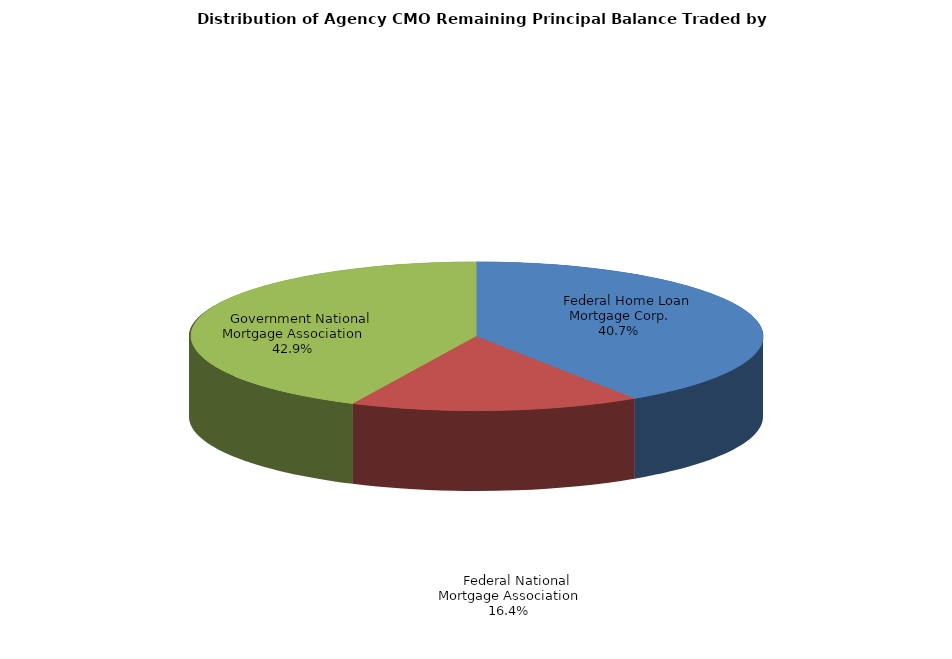
| Category | Series 0 |
|---|---|
|     Federal Home Loan Mortgage Corp. | 1425899360.162 |
|     Federal National Mortgage Association | 572955167.69 |
|     Government National Mortgage Association | 1504504248.586 |